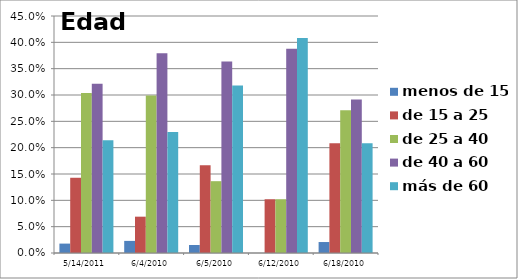
| Category | menos de 15 | de 15 a 25 | de 25 a 40 | de 40 a 60 | más de 60 |
|---|---|---|---|---|---|
| 14/05/2011 | 0.018 | 0.143 | 0.304 | 0.321 | 0.214 |
| 04/06/2010 | 0.023 | 0.069 | 0.299 | 0.379 | 0.23 |
| 05/06/2010 | 0.015 | 0.167 | 0.136 | 0.364 | 0.318 |
| 12/06/2010 | 0 | 0.102 | 0.102 | 0.388 | 0.408 |
| 18/06/2010 | 0.021 | 0.208 | 0.271 | 0.292 | 0.208 |